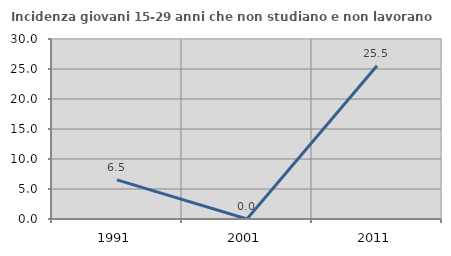
| Category | Incidenza giovani 15-29 anni che non studiano e non lavorano  |
|---|---|
| 1991.0 | 6.522 |
| 2001.0 | 0 |
| 2011.0 | 25.532 |